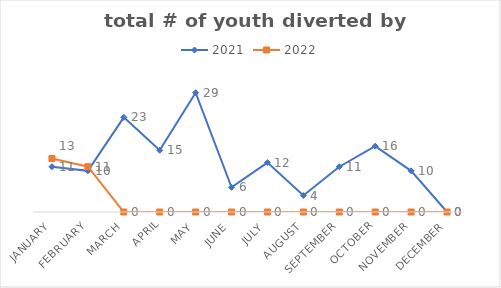
| Category | 2021 | 2022 |
|---|---|---|
| January | 11 | 13 |
| February | 10 | 11 |
| March | 23 | 0 |
| April | 15 | 0 |
| May | 29 | 0 |
| June | 6 | 0 |
| July | 12 | 0 |
| August | 4 | 0 |
| September | 11 | 0 |
| October | 16 | 0 |
| November | 10 | 0 |
| December | 0 | 0 |